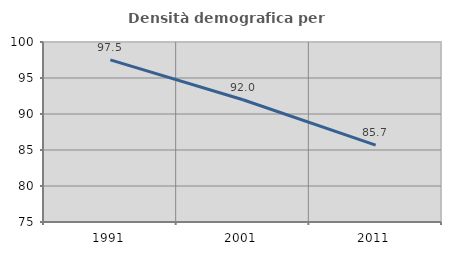
| Category | Densità demografica |
|---|---|
| 1991.0 | 97.521 |
| 2001.0 | 91.974 |
| 2011.0 | 85.676 |